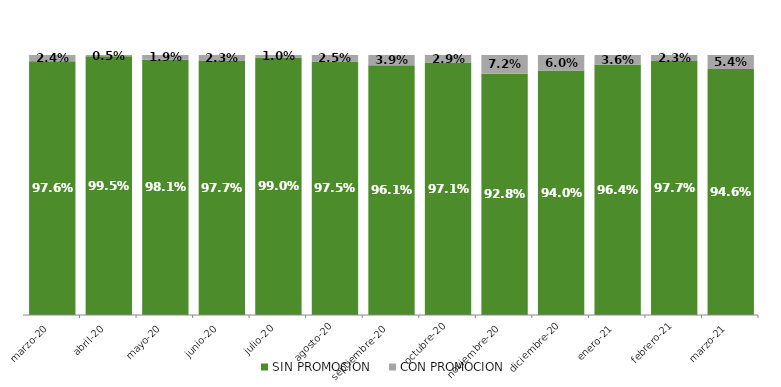
| Category | SIN PROMOCION   | CON PROMOCION   |
|---|---|---|
| 2020-03-01 | 0.976 | 0.024 |
| 2020-04-01 | 0.995 | 0.005 |
| 2020-05-01 | 0.981 | 0.019 |
| 2020-06-01 | 0.977 | 0.023 |
| 2020-07-01 | 0.99 | 0.01 |
| 2020-08-01 | 0.975 | 0.025 |
| 2020-09-01 | 0.961 | 0.039 |
| 2020-10-01 | 0.971 | 0.029 |
| 2020-11-01 | 0.928 | 0.072 |
| 2020-12-01 | 0.94 | 0.06 |
| 2021-01-01 | 0.964 | 0.036 |
| 2021-02-01 | 0.977 | 0.023 |
| 2021-03-01 | 0.946 | 0.054 |